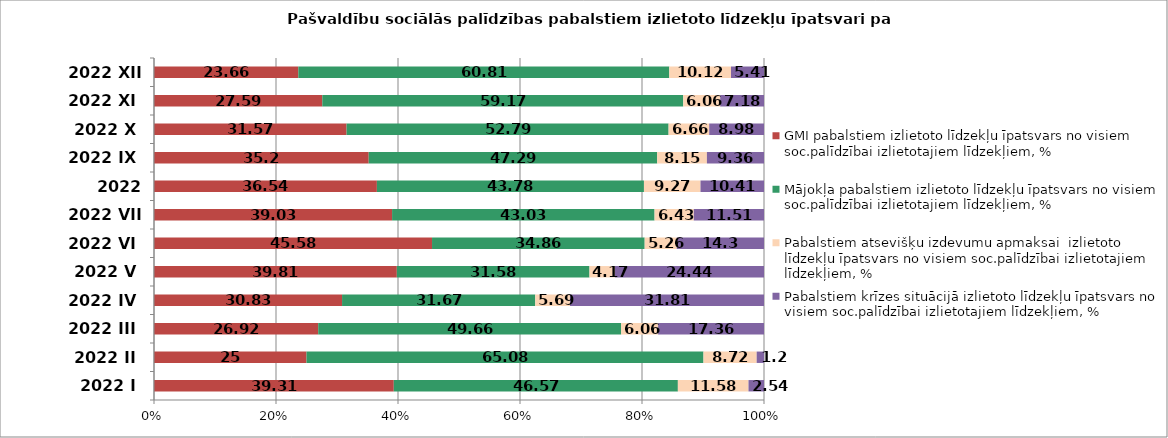
| Category | GMI pabalstiem izlietoto līdzekļu īpatsvars no visiem soc.palīdzībai izlietotajiem līdzekļiem, % | Mājokļa pabalstiem izlietoto līdzekļu īpatsvars no visiem soc.palīdzībai izlietotajiem līdzekļiem, % | Pabalstiem atsevišķu izdevumu apmaksai  izlietoto līdzekļu īpatsvars no visiem soc.palīdzībai izlietotajiem līdzekļiem, % | Pabalstiem krīzes situācijā izlietoto līdzekļu īpatsvars no visiem soc.palīdzībai izlietotajiem līdzekļiem, % |
|---|---|---|---|---|
| 2022 I | 39.31 | 46.57 | 11.58 | 2.54 |
| 2022 II | 25 | 65.08 | 8.72 | 1.2 |
| 2022 III | 26.92 | 49.66 | 6.06 | 17.36 |
| 2022 IV | 30.83 | 31.67 | 5.69 | 31.81 |
| 2022 V | 39.81 | 31.58 | 4.17 | 24.44 |
| 2022 VI | 45.58 | 34.86 | 5.26 | 14.3 |
| 2022 VII | 39.03 | 43.03 | 6.43 | 11.51 |
| 2022 VIII | 36.54 | 43.78 | 9.27 | 10.41 |
| 2022 IX | 35.2 | 47.29 | 8.15 | 9.36 |
| 2022 X | 31.57 | 52.79 | 6.66 | 8.98 |
| 2022 XI | 27.59 | 59.17 | 6.06 | 7.18 |
| 2022 XII | 23.66 | 60.81 | 10.12 | 5.41 |